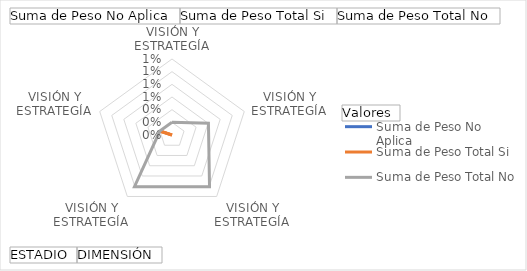
| Category | Suma de Peso No Aplica | Suma de Peso Total Si | Suma de Peso Total No |
|---|---|---|---|
| 0 | 0 | 0 | 0.002 |
| 1 | 0 | 0 | 0.006 |
| 2 | 0 | 0 | 0.01 |
| 3 | 0 | 0 | 0.01 |
| 4 | 0 | 0.002 | 0.002 |